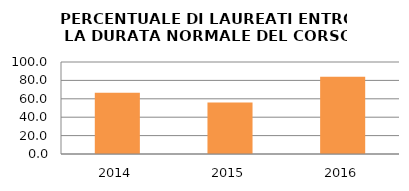
| Category | 2014 2015 2016 |
|---|---|
| 2014.0 | 66.667 |
| 2015.0 | 55.882 |
| 2016.0 | 83.871 |